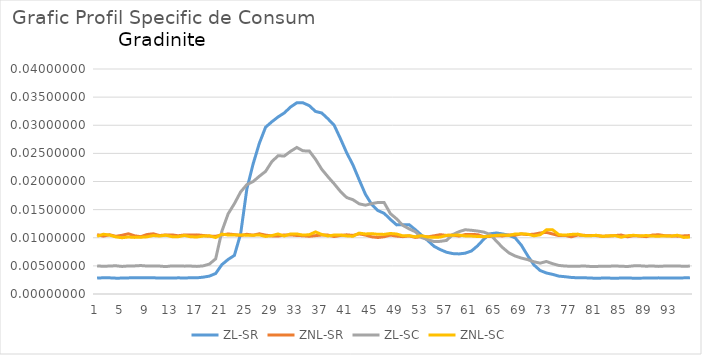
| Category | ZL-SR | ZNL-SR | ZL-SC | ZNL-SC |
|---|---|---|---|---|
| 0 | 0.003 | 0.011 | 0.005 | 0.01 |
| 1 | 0.003 | 0.01 | 0.005 | 0.011 |
| 2 | 0.003 | 0.011 | 0.005 | 0.01 |
| 3 | 0.003 | 0.01 | 0.005 | 0.01 |
| 4 | 0.003 | 0.01 | 0.005 | 0.01 |
| 5 | 0.003 | 0.011 | 0.005 | 0.01 |
| 6 | 0.003 | 0.01 | 0.005 | 0.01 |
| 7 | 0.003 | 0.01 | 0.005 | 0.01 |
| 8 | 0.003 | 0.011 | 0.005 | 0.01 |
| 9 | 0.003 | 0.011 | 0.005 | 0.01 |
| 10 | 0.003 | 0.01 | 0.005 | 0.01 |
| 11 | 0.003 | 0.011 | 0.005 | 0.01 |
| 12 | 0.003 | 0.011 | 0.005 | 0.01 |
| 13 | 0.003 | 0.01 | 0.005 | 0.01 |
| 14 | 0.003 | 0.011 | 0.005 | 0.01 |
| 15 | 0.003 | 0.01 | 0.005 | 0.01 |
| 16 | 0.003 | 0.011 | 0.005 | 0.01 |
| 17 | 0.003 | 0.01 | 0.005 | 0.01 |
| 18 | 0.003 | 0.01 | 0.005 | 0.01 |
| 19 | 0.004 | 0.01 | 0.006 | 0.01 |
| 20 | 0.005 | 0.01 | 0.011 | 0.011 |
| 21 | 0.006 | 0.011 | 0.014 | 0.01 |
| 22 | 0.007 | 0.011 | 0.016 | 0.011 |
| 23 | 0.011 | 0.01 | 0.018 | 0.01 |
| 24 | 0.019 | 0.011 | 0.019 | 0.01 |
| 25 | 0.023 | 0.01 | 0.02 | 0.01 |
| 26 | 0.027 | 0.011 | 0.021 | 0.011 |
| 27 | 0.03 | 0.01 | 0.022 | 0.01 |
| 28 | 0.031 | 0.01 | 0.024 | 0.01 |
| 29 | 0.031 | 0.01 | 0.025 | 0.011 |
| 30 | 0.032 | 0.011 | 0.025 | 0.01 |
| 31 | 0.033 | 0.011 | 0.025 | 0.011 |
| 32 | 0.034 | 0.01 | 0.026 | 0.011 |
| 33 | 0.034 | 0.01 | 0.025 | 0.01 |
| 34 | 0.033 | 0.01 | 0.025 | 0.011 |
| 35 | 0.032 | 0.01 | 0.024 | 0.011 |
| 36 | 0.032 | 0.01 | 0.022 | 0.011 |
| 37 | 0.031 | 0.01 | 0.021 | 0.01 |
| 38 | 0.03 | 0.01 | 0.02 | 0.01 |
| 39 | 0.028 | 0.01 | 0.018 | 0.01 |
| 40 | 0.025 | 0.011 | 0.017 | 0.01 |
| 41 | 0.023 | 0.01 | 0.017 | 0.01 |
| 42 | 0.02 | 0.011 | 0.016 | 0.011 |
| 43 | 0.018 | 0.01 | 0.016 | 0.011 |
| 44 | 0.016 | 0.01 | 0.016 | 0.011 |
| 45 | 0.015 | 0.01 | 0.016 | 0.011 |
| 46 | 0.014 | 0.01 | 0.016 | 0.011 |
| 47 | 0.013 | 0.01 | 0.014 | 0.011 |
| 48 | 0.012 | 0.01 | 0.013 | 0.011 |
| 49 | 0.012 | 0.01 | 0.012 | 0.01 |
| 50 | 0.012 | 0.01 | 0.012 | 0.01 |
| 51 | 0.011 | 0.01 | 0.011 | 0.01 |
| 52 | 0.01 | 0.01 | 0.01 | 0.01 |
| 53 | 0.009 | 0.01 | 0.01 | 0.01 |
| 54 | 0.008 | 0.01 | 0.009 | 0.01 |
| 55 | 0.008 | 0.011 | 0.009 | 0.01 |
| 56 | 0.007 | 0.01 | 0.01 | 0.01 |
| 57 | 0.007 | 0.01 | 0.011 | 0.01 |
| 58 | 0.007 | 0.01 | 0.011 | 0.01 |
| 59 | 0.007 | 0.011 | 0.011 | 0.01 |
| 60 | 0.008 | 0.011 | 0.011 | 0.01 |
| 61 | 0.009 | 0.011 | 0.011 | 0.01 |
| 62 | 0.01 | 0.01 | 0.011 | 0.01 |
| 63 | 0.011 | 0.01 | 0.011 | 0.01 |
| 64 | 0.011 | 0.01 | 0.009 | 0.01 |
| 65 | 0.011 | 0.01 | 0.008 | 0.011 |
| 66 | 0.01 | 0.011 | 0.007 | 0.01 |
| 67 | 0.01 | 0.01 | 0.007 | 0.011 |
| 68 | 0.009 | 0.011 | 0.006 | 0.011 |
| 69 | 0.007 | 0.011 | 0.006 | 0.011 |
| 70 | 0.005 | 0.011 | 0.006 | 0.01 |
| 71 | 0.004 | 0.011 | 0.005 | 0.011 |
| 72 | 0.004 | 0.011 | 0.006 | 0.011 |
| 73 | 0.003 | 0.011 | 0.005 | 0.011 |
| 74 | 0.003 | 0.01 | 0.005 | 0.011 |
| 75 | 0.003 | 0.01 | 0.005 | 0.01 |
| 76 | 0.003 | 0.01 | 0.005 | 0.011 |
| 77 | 0.003 | 0.01 | 0.005 | 0.011 |
| 78 | 0.003 | 0.01 | 0.005 | 0.01 |
| 79 | 0.003 | 0.01 | 0.005 | 0.01 |
| 80 | 0.003 | 0.01 | 0.005 | 0.01 |
| 81 | 0.003 | 0.01 | 0.005 | 0.01 |
| 82 | 0.003 | 0.01 | 0.005 | 0.01 |
| 83 | 0.003 | 0.01 | 0.005 | 0.01 |
| 84 | 0.003 | 0.01 | 0.005 | 0.01 |
| 85 | 0.003 | 0.01 | 0.005 | 0.01 |
| 86 | 0.003 | 0.01 | 0.005 | 0.01 |
| 87 | 0.003 | 0.01 | 0.005 | 0.01 |
| 88 | 0.003 | 0.01 | 0.005 | 0.01 |
| 89 | 0.003 | 0.01 | 0.005 | 0.01 |
| 90 | 0.003 | 0.011 | 0.005 | 0.01 |
| 91 | 0.003 | 0.01 | 0.005 | 0.01 |
| 92 | 0.003 | 0.01 | 0.005 | 0.01 |
| 93 | 0.003 | 0.01 | 0.005 | 0.01 |
| 94 | 0.003 | 0.01 | 0.005 | 0.01 |
| 95 | 0.003 | 0.01 | 0.005 | 0.01 |